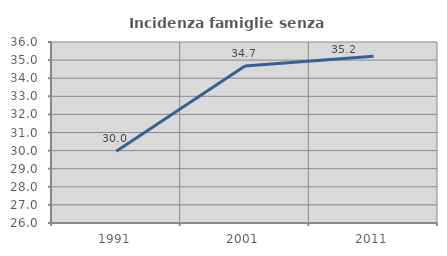
| Category | Incidenza famiglie senza nuclei |
|---|---|
| 1991.0 | 29.966 |
| 2001.0 | 34.676 |
| 2011.0 | 35.209 |